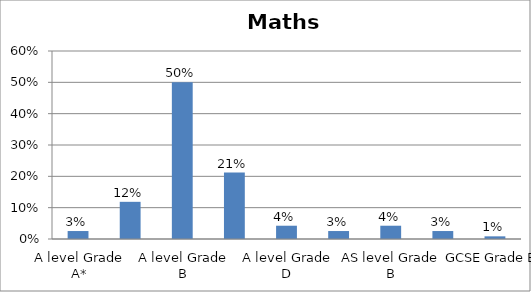
| Category | Series 0 |
|---|---|
| A level Grade A* | 0.025 |
| A level Grade A | 0.119 |
| A level Grade B | 0.5 |
| A level Grade C | 0.212 |
| A level Grade D | 0.042 |
| AS level Grade A | 0.025 |
| AS level Grade B | 0.042 |
| AS level Grade C | 0.025 |
| GCSE Grade B | 0.008 |